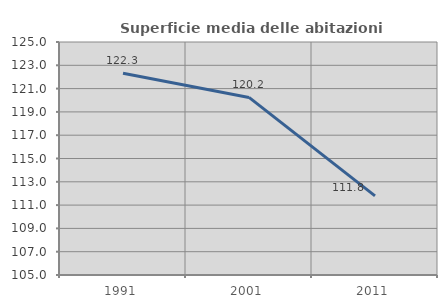
| Category | Superficie media delle abitazioni occupate |
|---|---|
| 1991.0 | 122.312 |
| 2001.0 | 120.242 |
| 2011.0 | 111.787 |